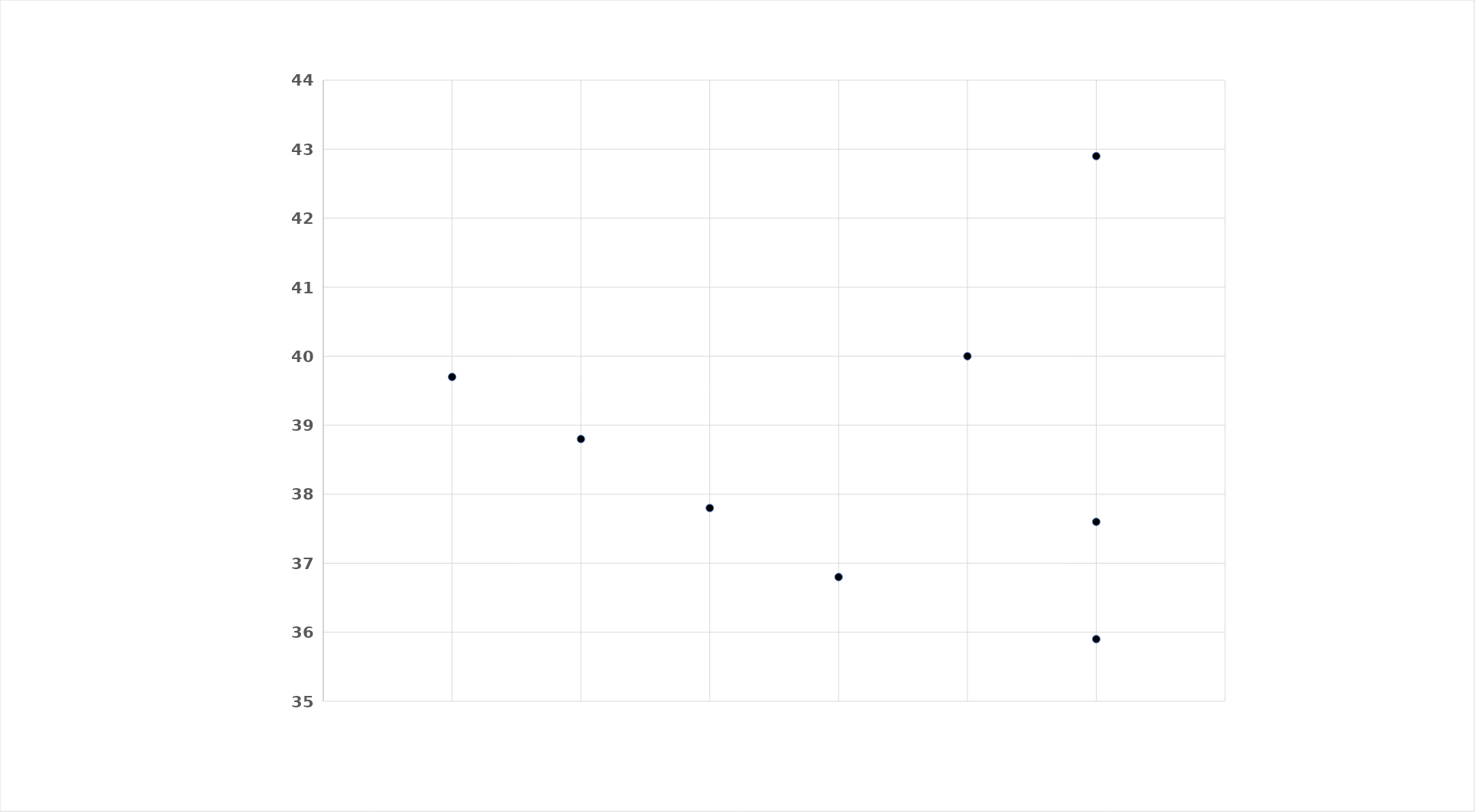
| Category | Series 0 |
|---|---|
| 1.0 | 39.7 |
| 2.0 | 38.8 |
| 3.0 | 37.8 |
| 4.0 | 36.8 |
| 5.0 | 40 |
| 6.0 | 35.9 |
| 6.0 | 37.6 |
| 6.0 | 42.9 |